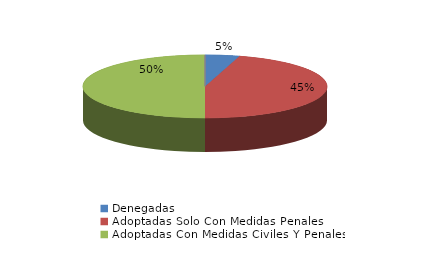
| Category | Series 0 |
|---|---|
| Denegadas | 1 |
| Adoptadas Solo Con Medidas Penales | 10 |
| Adoptadas Con Medidas Civiles Y Penales | 11 |
| Adoptadas Con Medidas Solo Civiles | 0 |